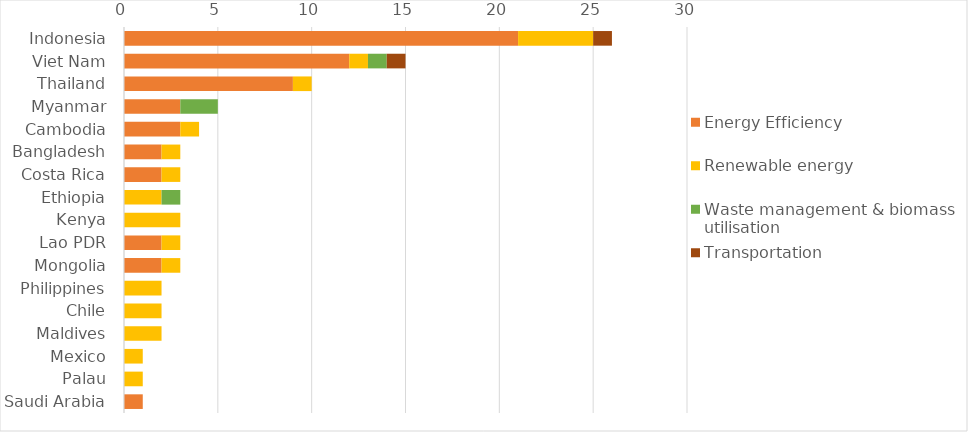
| Category | Energy Efficiency | Renewable energy | Waste management & biomass utilisation | Transportation |
|---|---|---|---|---|
| Indonesia | 21 | 4 | 0 | 1 |
| Viet Nam | 12 | 1 | 1 | 1 |
| Thailand | 9 | 1 | 0 | 0 |
| Myanmar | 3 | 0 | 2 | 0 |
| Cambodia | 3 | 1 | 0 | 0 |
| Bangladesh | 2 | 1 | 0 | 0 |
| Costa Rica | 2 | 1 | 0 | 0 |
| Ethiopia | 0 | 2 | 1 | 0 |
| Kenya | 0 | 3 | 0 | 0 |
| Lao PDR | 2 | 1 | 0 | 0 |
| Mongolia | 2 | 1 | 0 | 0 |
| Philippines | 0 | 2 | 0 | 0 |
| Chile | 0 | 2 | 0 | 0 |
| Maldives | 0 | 2 | 0 | 0 |
| Mexico | 0 | 1 | 0 | 0 |
| Palau | 0 | 1 | 0 | 0 |
| Saudi Arabia | 1 | 0 | 0 | 0 |